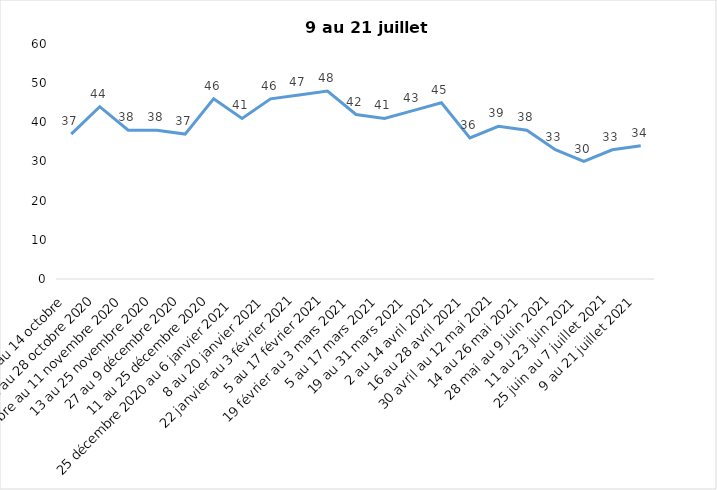
| Category | Toujours aux trois mesures |
|---|---|
| 2 au 14 octobre  | 37 |
| 16 au 28 octobre 2020 | 44 |
| 30 octobre au 11 novembre 2020 | 38 |
| 13 au 25 novembre 2020 | 38 |
| 27 au 9 décembre 2020 | 37 |
| 11 au 25 décembre 2020 | 46 |
| 25 décembre 2020 au 6 janvier 2021 | 41 |
| 8 au 20 janvier 2021 | 46 |
| 22 janvier au 3 février 2021 | 47 |
| 5 au 17 février 2021 | 48 |
| 19 février au 3 mars 2021 | 42 |
| 5 au 17 mars 2021 | 41 |
| 19 au 31 mars 2021 | 43 |
| 2 au 14 avril 2021 | 45 |
| 16 au 28 avril 2021 | 36 |
| 30 avril au 12 mai 2021 | 39 |
| 14 au 26 mai 2021 | 38 |
| 28 mai au 9 juin 2021 | 33 |
| 11 au 23 juin 2021 | 30 |
| 25 juin au 7 juillet 2021 | 33 |
| 9 au 21 juillet 2021 | 34 |